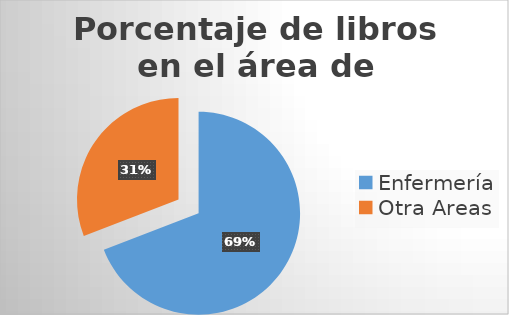
| Category | Series 0 |
|---|---|
| Enfermería | 130 |
| Otra Areas | 58 |